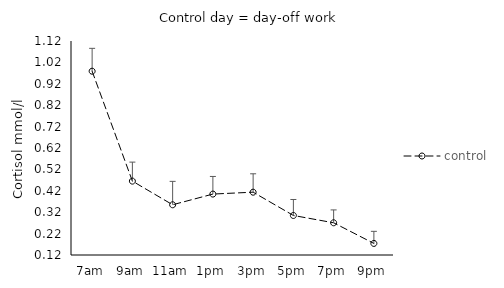
| Category | control |
|---|---|
| 7am | 0.979 |
| 9am | 0.465 |
| 11am | 0.355 |
| 1pm | 0.405 |
| 3pm | 0.414 |
| 5pm | 0.305 |
| 7pm | 0.271 |
| 9pm | 0.174 |